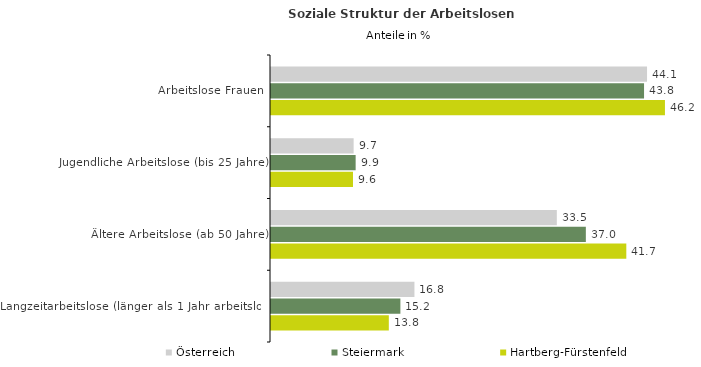
| Category | Österreich | Steiermark | Hartberg-Fürstenfeld |
|---|---|---|---|
| Arbeitslose Frauen | 44.136 | 43.785 | 46.239 |
| Jugendliche Arbeitslose (bis 25 Jahre) | 9.698 | 9.935 | 9.624 |
| Ältere Arbeitslose (ab 50 Jahre) | 33.548 | 36.954 | 41.704 |
| Langzeitarbeitslose (länger als 1 Jahr arbeitslos) | 16.836 | 15.186 | 13.827 |